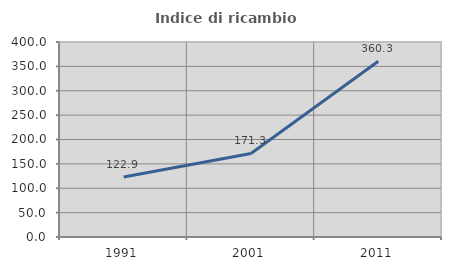
| Category | Indice di ricambio occupazionale  |
|---|---|
| 1991.0 | 122.941 |
| 2001.0 | 171.287 |
| 2011.0 | 360.345 |